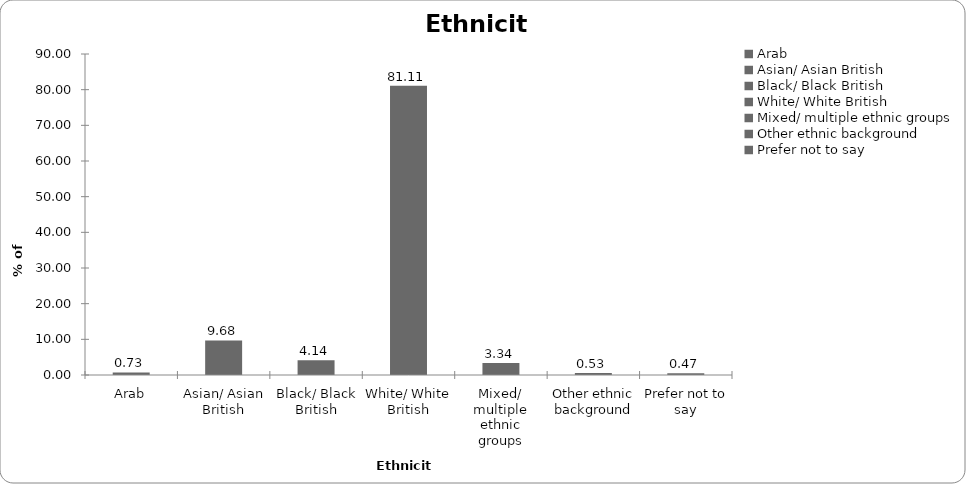
| Category | Ethnicity |
|---|---|
| Arab | 0.734 |
| Asian/ Asian British | 9.68 |
| Black/ Black British | 4.139 |
| White/ White British | 81.108 |
| Mixed/ multiple ethnic groups | 3.338 |
| Other ethnic background | 0.534 |
| Prefer not to say | 0.467 |